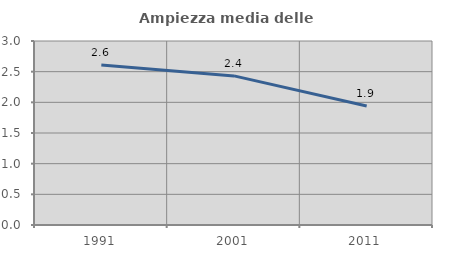
| Category | Ampiezza media delle famiglie |
|---|---|
| 1991.0 | 2.611 |
| 2001.0 | 2.431 |
| 2011.0 | 1.941 |